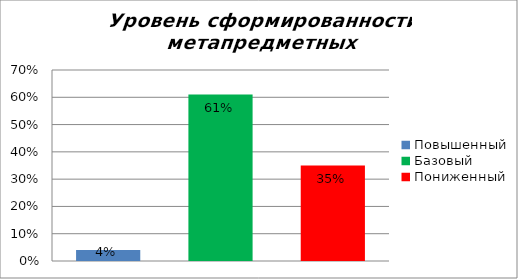
| Category | Уровень сформированности метапредметных результатов |
|---|---|
| Повышенный | 0.04 |
| Базовый | 0.61 |
| Пониженный | 0.35 |